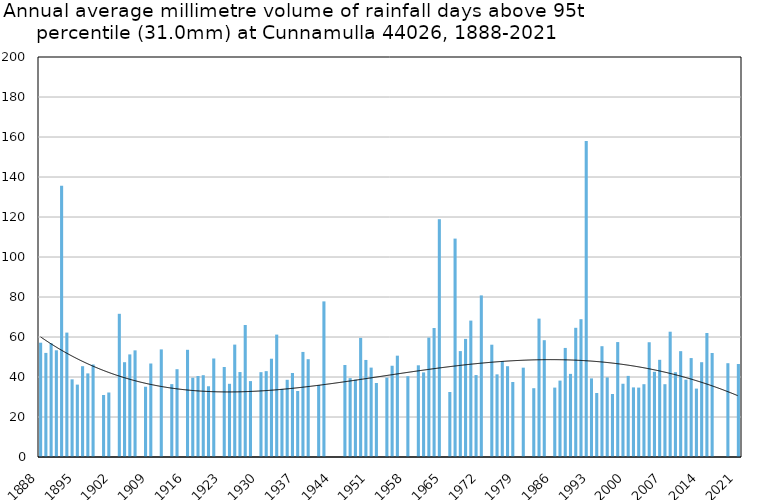
| Category | Annual average mm in days above 95th percentile |
|---|---|
| 1888 | 57.15 |
| 1889 | 52.05 |
| 1890 | 56.86 |
| 1891 | 53.35 |
| 1892 | 135.6 |
| 1893 | 62.2 |
| 1894 | 38.825 |
| 1895 | 36.2 |
| 1896 | 45.4 |
| 1897 | 41.8 |
| 1898 | 46.25 |
| 1899 | 0 |
| 1900 | 31 |
| 1901 | 32.25 |
| 1902 | 0 |
| 1903 | 71.6 |
| 1904 | 47.4 |
| 1905 | 51.3 |
| 1906 | 53.325 |
| 1907 | 0 |
| 1908 | 35.133 |
| 1909 | 46.75 |
| 1910 | 0 |
| 1911 | 53.8 |
| 1912 | 0 |
| 1913 | 36.433 |
| 1914 | 43.9 |
| 1915 | 0 |
| 1916 | 53.6 |
| 1917 | 39.65 |
| 1918 | 40.5 |
| 1919 | 40.9 |
| 1920 | 35.375 |
| 1921 | 49.257 |
| 1922 | 0 |
| 1923 | 45 |
| 1924 | 36.6 |
| 1925 | 56.2 |
| 1926 | 42.475 |
| 1927 | 66 |
| 1928 | 37.95 |
| 1929 | 0 |
| 1930 | 42.42 |
| 1931 | 42.933 |
| 1932 | 49.15 |
| 1933 | 61.2 |
| 1934 | 34.05 |
| 1935 | 38.6 |
| 1936 | 42 |
| 1937 | 33 |
| 1938 | 52.533 |
| 1939 | 48.9 |
| 1940 | 0 |
| 1941 | 36 |
| 1942 | 77.8 |
| 1943 | 0 |
| 1944 | 0 |
| 1945 | 0 |
| 1946 | 46 |
| 1947 | 39.433 |
| 1948 | 38.68 |
| 1949 | 59.56 |
| 1950 | 48.525 |
| 1951 | 44.7 |
| 1952 | 37 |
| 1953 | 0 |
| 1954 | 39.683 |
| 1955 | 45.633 |
| 1956 | 50.67 |
| 1957 | 0 |
| 1958 | 40.4 |
| 1959 | 0 |
| 1960 | 45.85 |
| 1961 | 42.3 |
| 1962 | 59.7 |
| 1963 | 64.5 |
| 1964 | 118.9 |
| 1965 | 0 |
| 1966 | 32.5 |
| 1967 | 109.2 |
| 1968 | 52.95 |
| 1969 | 59.05 |
| 1970 | 68.2 |
| 1971 | 40.967 |
| 1972 | 80.8 |
| 1973 | 0 |
| 1974 | 56.15 |
| 1975 | 41.32 |
| 1976 | 47.943 |
| 1977 | 45.4 |
| 1978 | 37.5 |
| 1979 | 0 |
| 1980 | 44.667 |
| 1981 | 0 |
| 1982 | 34.4 |
| 1983 | 69.2 |
| 1984 | 58.4 |
| 1985 | 0 |
| 1986 | 34.7 |
| 1987 | 38.2 |
| 1988 | 54.533 |
| 1989 | 41.56 |
| 1990 | 64.6 |
| 1991 | 68.9 |
| 1992 | 158 |
| 1993 | 39.3 |
| 1994 | 32 |
| 1995 | 55.4 |
| 1996 | 39.8 |
| 1997 | 31.5 |
| 1998 | 57.467 |
| 1999 | 36.633 |
| 2000 | 40.55 |
| 2001 | 34.8 |
| 2002 | 34.7 |
| 2003 | 36.4 |
| 2004 | 57.38 |
| 2005 | 42.6 |
| 2006 | 48.6 |
| 2007 | 36.4 |
| 2008 | 62.65 |
| 2009 | 42.4 |
| 2010 | 52.92 |
| 2011 | 38.667 |
| 2012 | 49.467 |
| 2013 | 34.2 |
| 2014 | 47.4 |
| 2015 | 62 |
| 2016 | 52 |
| 2017 | 0 |
| 2018 | 0 |
| 2019 | 46.9 |
| 2020 | 0 |
| 2021 | 46.5 |